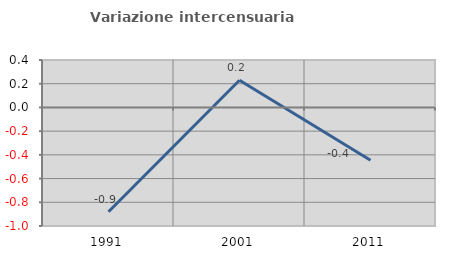
| Category | Variazione intercensuaria annua |
|---|---|
| 1991.0 | -0.88 |
| 2001.0 | 0.229 |
| 2011.0 | -0.446 |